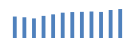
| Category | Exportações (1) |
|---|---|
| 0 | 595986.616 |
| 1 | 575965.577 |
| 2 | 544011.291 |
| 3 | 614380.205 |
| 4 | 656918.26 |
| 5 | 703504.835 |
| 6 | 720793.562 |
| 7 | 726284.803 |
| 8 | 735533.905 |
| 9 | 723973.625 |
| 10 | 778041 |
| 11 | 804147.521 |